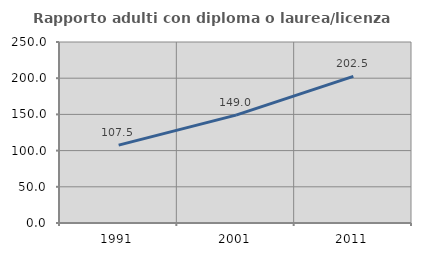
| Category | Rapporto adulti con diploma o laurea/licenza media  |
|---|---|
| 1991.0 | 107.514 |
| 2001.0 | 149.015 |
| 2011.0 | 202.456 |